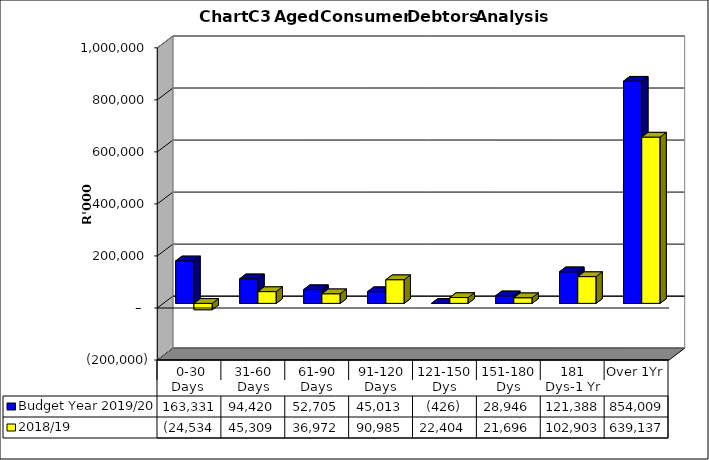
| Category | Budget Year 2019/20 | 2018/19 |
|---|---|---|
|  0-30 Days  | 163330941 | -24533636.09 |
| 31-60 Days | 94419854 | 45308761.37 |
| 61-90 Days | 52705063 | 36971785.76 |
| 91-120 Days | 45013053 | 90984723.92 |
| 121-150 Dys | -426266 | 22403788.88 |
| 151-180 Dys | 28945538 | 21695609.96 |
| 181 Dys-1 Yr | 121387866 | 102903266.15 |
| Over 1Yr | 854009291 | 639136615.93 |